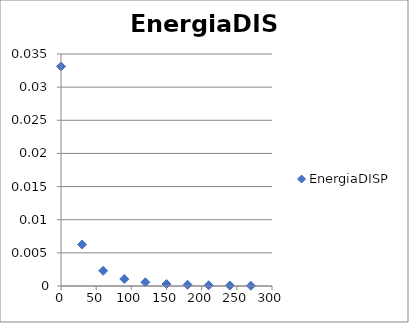
| Category | EnergiaDISP |
|---|---|
| 0.0 | 0.033 |
| 30.0 | 0.006 |
| 60.0 | 0.002 |
| 90.0 | 0.001 |
| 120.0 | 0.001 |
| 150.0 | 0 |
| 180.0 | 0 |
| 210.0 | 0 |
| 240.0 | 0 |
| 270.0 | 0 |